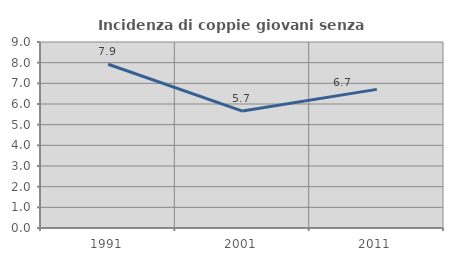
| Category | Incidenza di coppie giovani senza figli |
|---|---|
| 1991.0 | 7.922 |
| 2001.0 | 5.656 |
| 2011.0 | 6.708 |